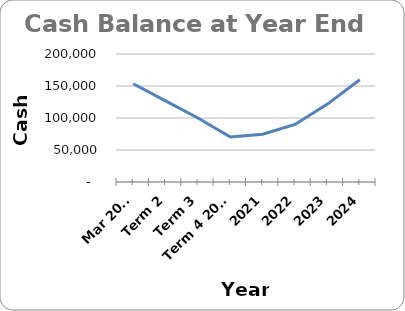
| Category | Series 0 |
|---|---|
| Mar 2020 | 153550 |
| Term 2 | 126789 |
| Term 3 | 100028 |
| Term 4 2020 | 70267 |
| 2021 | 74713.7 |
| 2022 | 89955.642 |
| 2023 | 121687.709 |
| 2024 | 159667.151 |